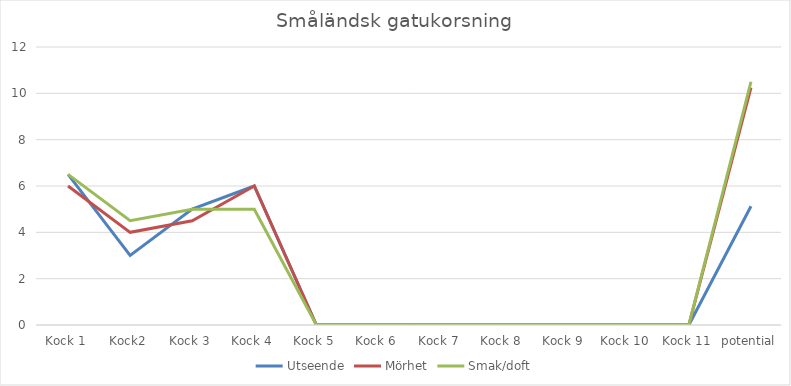
| Category | Utseende | Mörhet | Smak/doft |
|---|---|---|---|
| Kock 1 | 6.5 | 6 | 6.5 |
| Kock2 | 3 | 4 | 4.5 |
| Kock 3 | 5 | 4.5 | 5 |
| Kock 4 | 6 | 6 | 5 |
| Kock 5 | 0 | 0 | 0 |
| Kock 6 | 0 | 0 | 0 |
| Kock 7 | 0 | 0 | 0 |
| Kock 8 | 0 | 0 | 0 |
| Kock 9 | 0 | 0 | 0 |
| Kock 10 | 0 | 0 | 0 |
| Kock 11 | 0 | 0 | 0 |
| potential | 5.125 | 10.25 | 10.5 |